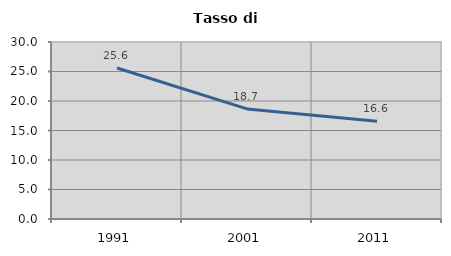
| Category | Tasso di disoccupazione   |
|---|---|
| 1991.0 | 25.595 |
| 2001.0 | 18.658 |
| 2011.0 | 16.575 |